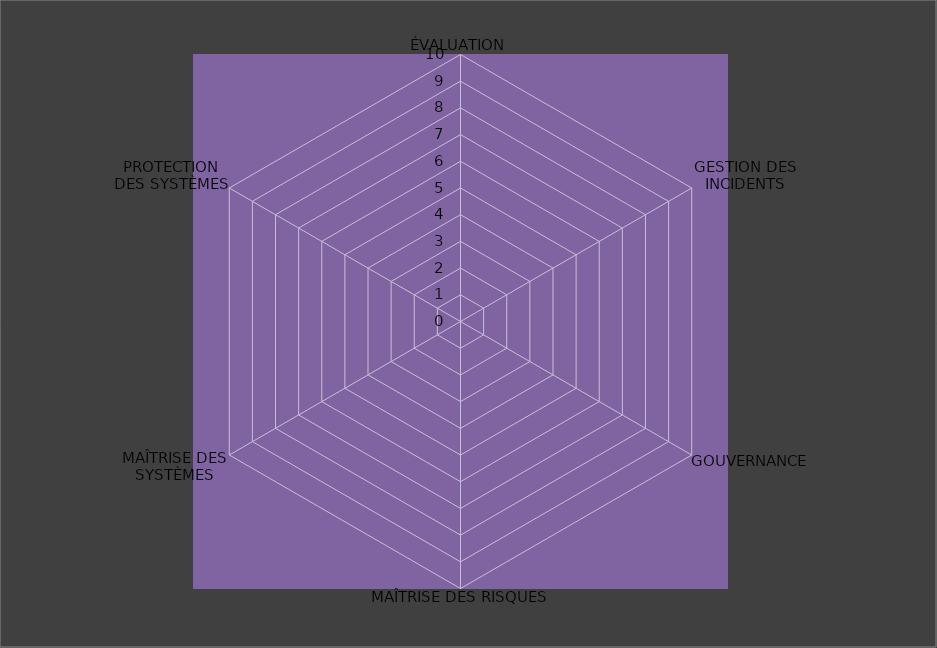
| Category | Année 2030 |
|---|---|
| ÉVALUATION | 0 |
| GESTION DES INCIDENTS | 0 |
| GOUVERNANCE | 0 |
| MAÎTRISE DES RISQUES | 0 |
| MAÎTRISE DES SYSTÈMES | 0 |
| PROTECTION
DES SYSTÈMES | 0 |